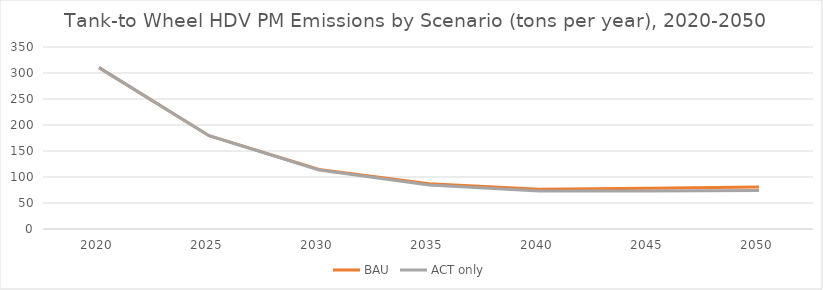
| Category | BAU | ACT only |
|---|---|---|
| 2020.0 | 310.376 | 310.376 |
| 2025.0 | 179.494 | 179.494 |
| 2030.0 | 114.342 | 113.603 |
| 2035.0 | 87.216 | 84.603 |
| 2040.0 | 76.598 | 72.992 |
| 2045.0 | 78.131 | 72.85 |
| 2050.0 | 80.894 | 74.146 |